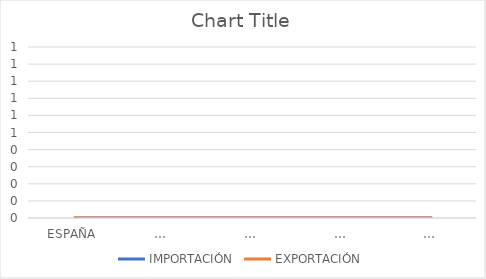
| Category | IMPORTACIÓN | EXPORTACIÓN |
|---|---|---|
| ESPAÑA | 0 | 0 |
| … | 0 | 0 |
| … | 0 | 0 |
| … | 0 | 0 |
| … | 0 | 0 |